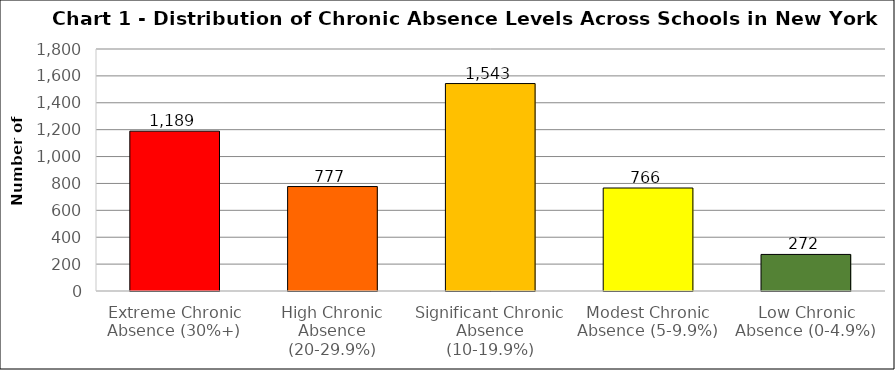
| Category | Series 0 |
|---|---|
| Extreme Chronic Absence (30%+) | 1189 |
| High Chronic Absence (20-29.9%) | 777 |
| Significant Chronic Absence (10-19.9%) | 1543 |
| Modest Chronic Absence (5-9.9%) | 766 |
| Low Chronic Absence (0-4.9%) | 272 |